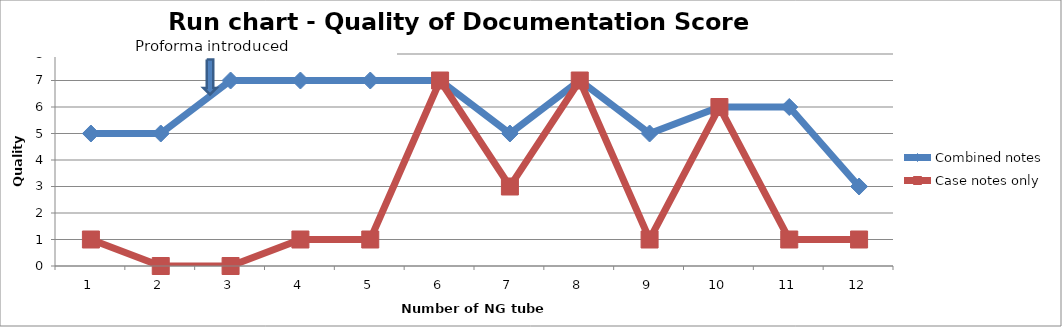
| Category | Combined notes | Case notes only |
|---|---|---|
| 0 | 5 | 1 |
| 1 | 5 | 0 |
| 2 | 7 | 0 |
| 3 | 7 | 1 |
| 4 | 7 | 1 |
| 5 | 7 | 7 |
| 6 | 5 | 3 |
| 7 | 7 | 7 |
| 8 | 5 | 1 |
| 9 | 6 | 6 |
| 10 | 6 | 1 |
| 11 | 3 | 1 |